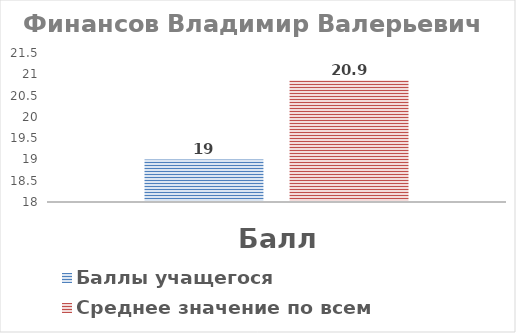
| Category | Баллы учащегося | Среднее значение по всем учащимся |
|---|---|---|
| Балл | 19 | 20.857 |